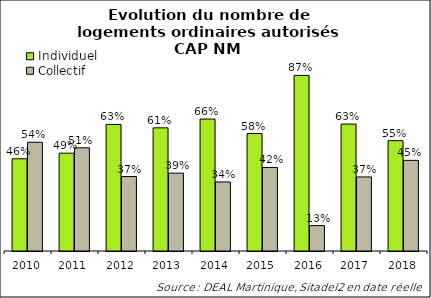
| Category | Individuel | Collectif |
|---|---|---|
| 2010.0 | 0.459 | 0.541 |
| 2011.0 | 0.487 | 0.513 |
| 2012.0 | 0.63 | 0.37 |
| 2013.0 | 0.613 | 0.387 |
| 2014.0 | 0.657 | 0.343 |
| 2015.0 | 0.584 | 0.416 |
| 2016.0 | 0.874 | 0.126 |
| 2017.0 | 0.632 | 0.368 |
| 2018.0 | 0.549 | 0.451 |